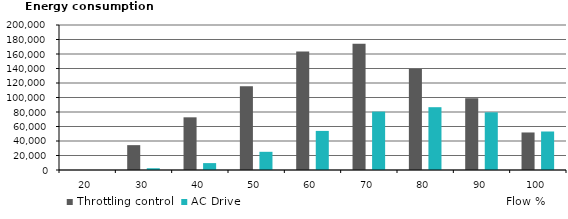
| Category | Throttling control | AC Drive  |
|---|---|---|
| 0 | 0 | 0 |
| 1 | 34286.917 | 2413.866 |
| 2 | 72662.973 | 9505.215 |
| 3 | 115563.322 | 25099.185 |
| 4 | 163586.303 | 53924.368 |
| 5 | 174062.273 | 80533.235 |
| 6 | 139387.146 | 86620.296 |
| 7 | 99092.313 | 79579.502 |
| 8 | 51772.368 | 53099.865 |